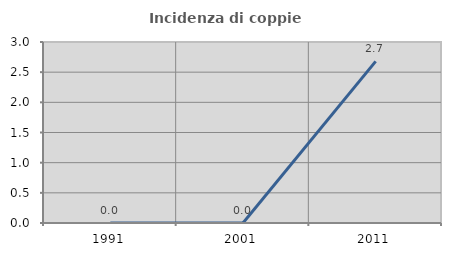
| Category | Incidenza di coppie miste |
|---|---|
| 1991.0 | 0 |
| 2001.0 | 0 |
| 2011.0 | 2.679 |